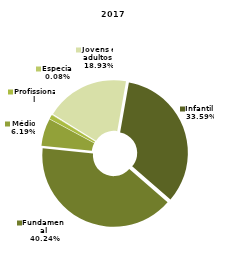
| Category | 2017 |
|---|---|
| Indígena | 0 |
| Remanescente de Quilombos | 0 |
| Infantil  | 2056 |
| Fundamental | 2463 |
| Médio | 379 |
| Profissional | 59 |
| Especial | 5 |
| Jovens e adultos | 1159 |